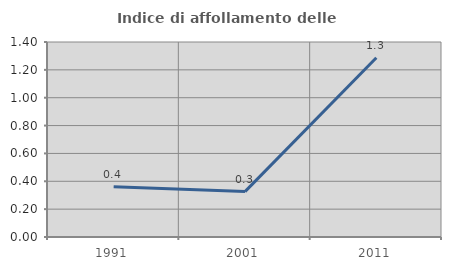
| Category | Indice di affollamento delle abitazioni  |
|---|---|
| 1991.0 | 0.36 |
| 2001.0 | 0.326 |
| 2011.0 | 1.287 |